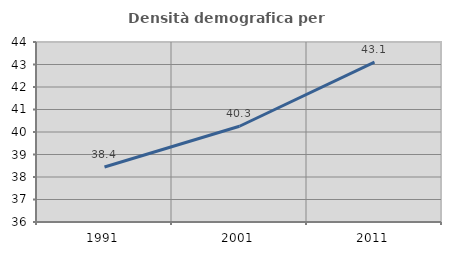
| Category | Densità demografica |
|---|---|
| 1991.0 | 38.444 |
| 2001.0 | 40.255 |
| 2011.0 | 43.105 |